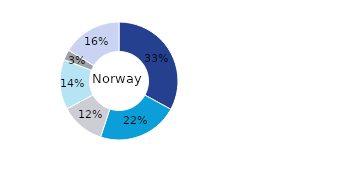
| Category | Norway |
|---|---|
| Office | 0.329 |
| Residential | 0.221 |
| Retail | 0.122 |
| Logistics* | 0.137 |
| Public Sector | 0.028 |
| Other | 0.163 |